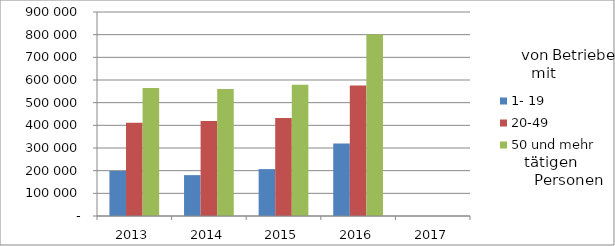
| Category | 1- 19 | 20-49 | 50 und mehr |
|---|---|---|---|
| 2013.0 | 198520.981 | 411220.539 | 565167.223 |
| 2014.0 | 180326.18 | 418921.142 | 560768.499 |
| 2015.0 | 206882.453 | 432377.754 | 578872.572 |
| 2016.0 | 319340.725 | 575670.955 | 800299.036 |
| 2017.0 | 0 | 0 | 0 |